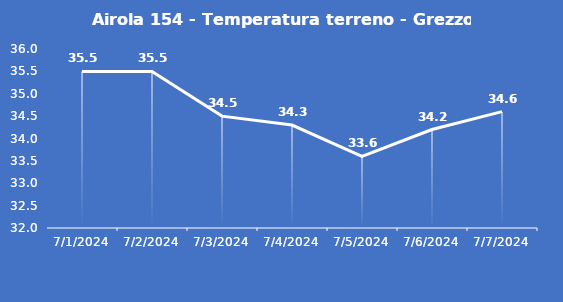
| Category | Airola 154 - Temperatura terreno - Grezzo (°C) |
|---|---|
| 7/1/24 | 35.5 |
| 7/2/24 | 35.5 |
| 7/3/24 | 34.5 |
| 7/4/24 | 34.3 |
| 7/5/24 | 33.6 |
| 7/6/24 | 34.2 |
| 7/7/24 | 34.6 |